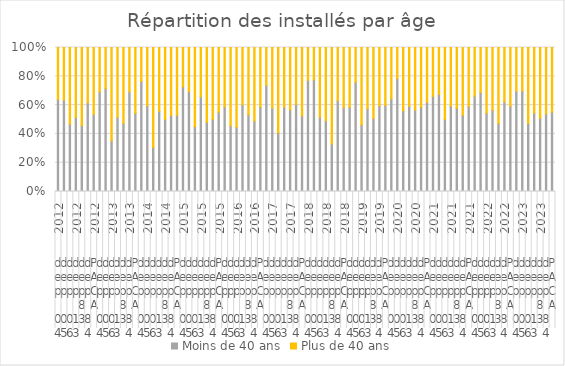
| Category | Moins de 40 ans | Plus de 40 ans |
|---|---|---|
| 0 | 62 | 35 |
| 1 | 50 | 29 |
| 2 | 43 | 49 |
| 3 | 95 | 90 |
| 4 | 85 | 101 |
| 5 | 83 | 52 |
| 6 | 414 | 360 |
| 7 | 67 | 30 |
| 8 | 60 | 24 |
| 9 | 26 | 48 |
| 10 | 111 | 105 |
| 11 | 95 | 106 |
| 12 | 103 | 46 |
| 13 | 445 | 375 |
| 14 | 68 | 21 |
| 15 | 41 | 28 |
| 16 | 33 | 75 |
| 17 | 97 | 77 |
| 18 | 89 | 89 |
| 19 | 88 | 79 |
| 20 | 416 | 369 |
| 21 | 69 | 26 |
| 22 | 52 | 23 |
| 23 | 40 | 49 |
| 24 | 109 | 57 |
| 25 | 100 | 108 |
| 26 | 77 | 77 |
| 27 | 433 | 354 |
| 28 | 71 | 50 |
| 29 | 41 | 49 |
| 30 | 41 | 51 |
| 31 | 98 | 65 |
| 32 | 129 | 114 |
| 33 | 93 | 97 |
| 34 | 527 | 372 |
| 35 | 67 | 24 |
| 36 | 48 | 35 |
| 37 | 35 | 51 |
| 38 | 110 | 78 |
| 39 | 93 | 71 |
| 40 | 96 | 63 |
| 41 | 404 | 367 |
| 42 | 71 | 21 |
| 43 | 55 | 16 |
| 44 | 33 | 31 |
| 45 | 77 | 80 |
| 46 | 65 | 132 |
| 47 | 119 | 70 |
| 48 | 448 | 322 |
| 49 | 62 | 44 |
| 50 | 53 | 17 |
| 51 | 30 | 35 |
| 52 | 97 | 72 |
| 53 | 78 | 76 |
| 54 | 103 | 70 |
| 55 | 440 | 297 |
| 56 | 72 | 40 |
| 57 | 58 | 16 |
| 58 | 42 | 33 |
| 59 | 103 | 71 |
| 60 | 103 | 79 |
| 61 | 106 | 75 |
| 62 | 493 | 304 |
| 63 | 80 | 41 |
| 64 | 58 | 28 |
| 65 | 38 | 38 |
| 66 | 89 | 61 |
| 67 | 96 | 70 |
| 68 | 87 | 77 |
| 69 | 450 | 313 |
| 70 | 82 | 42 |
| 71 | 66 | 30 |
| 72 | 43 | 36 |
| 73 | 107 | 83 |
| 74 | 95 | 106 |
| 75 | 126 | 77 |
| 76 | 529 | 364 |
| 77 | 85 | 37 |
| 78 | 53 | 23 |
| 79 | 43 | 48 |
| 80 | 87 | 73 |
| 81 | 92 | 89 |
| 82 | 92 | 79 |
| 83 | 441 | 360 |